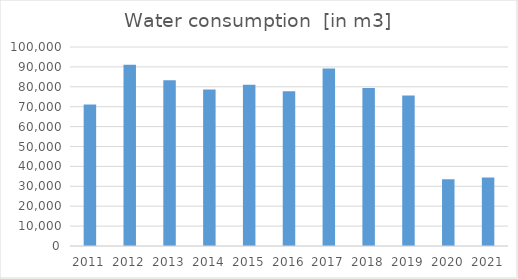
| Category | [m3] |
|---|---|
| 2011.0 | 71094 |
| 2012.0 | 91081 |
| 2013.0 | 83354 |
| 2014.0 | 78633 |
| 2015.0 | 81054 |
| 2016.0 | 77766 |
| 2017.0 | 89230 |
| 2018.0 | 79451 |
| 2019.0 | 75572 |
| 2020.0 | 33551 |
| 2021.0 | 34369 |